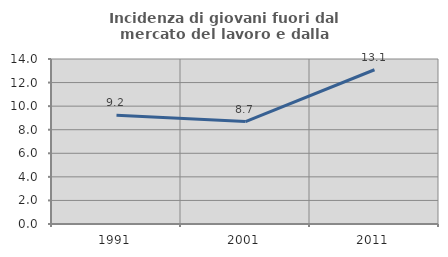
| Category | Incidenza di giovani fuori dal mercato del lavoro e dalla formazione  |
|---|---|
| 1991.0 | 9.218 |
| 2001.0 | 8.687 |
| 2011.0 | 13.087 |